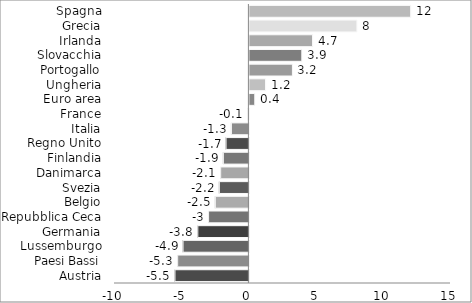
| Category | Series 0 |
|---|---|
| Austria | -5.5 |
| Paesi Bassi | -5.3 |
| Lussemburgo | -4.9 |
| Germania | -3.8 |
| Repubblica Ceca | -3 |
| Belgio | -2.5 |
| Svezia | -2.2 |
| Danimarca | -2.1 |
| Finlandia | -1.9 |
| Regno Unito | -1.7 |
| Italia | -1.3 |
| France | -0.1 |
| Euro area | 0.4 |
| Ungheria | 1.2 |
| Portogallo | 3.2 |
| Slovacchia | 3.9 |
| Irlanda | 4.7 |
| Grecia | 8 |
| Spagna | 12 |